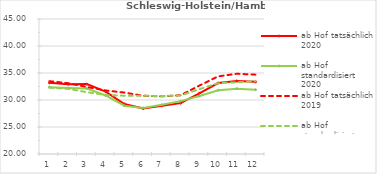
| Category | ab Hof tatsächlich 2020 | ab Hof standardisiert 2020 | ab Hof tatsächlich 2019 | ab Hof standardisiert 2019 |
|---|---|---|---|---|
| 0 | 33.176 | 32.369 | 33.485 | 32.284 |
| 1 | 32.923 | 32.226 | 33.11 | 32.062 |
| 2 | 32.945 | 32.141 | 32.412 | 31.45 |
| 3 | 31.561 | 30.84 | 31.772 | 30.917 |
| 4 | 29.264 | 28.951 | 31.374 | 30.797 |
| 5 | 28.411 | 28.541 | 30.782 | 30.787 |
| 6 | 28.916 | 29.107 | 30.672 | 30.731 |
| 7 | 29.417 | 29.795 | 30.885 | 30.848 |
| 8 | 31.236 | 30.738 | 32.665 | 32.008 |
| 9 | 33.143 | 31.812 | 34.373 | 33.117 |
| 10 | 33.533 | 32.102 | 34.859 | 33.285 |
| 11 | 33.359 | 31.911 | 34.692 | 33.488 |